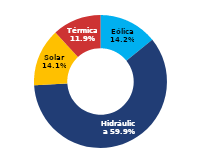
| Category | Sur |
|---|---|
| Eólica | 77.129 |
| Hidráulica | 324.765 |
| Solar | 76.332 |
| Térmica | 64.339 |